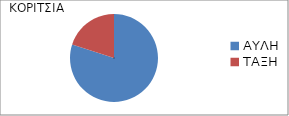
| Category | Series 0 |
|---|---|
| ΑΥΛΗ | 0.8 |
| ΤΑΞΗ | 0.2 |